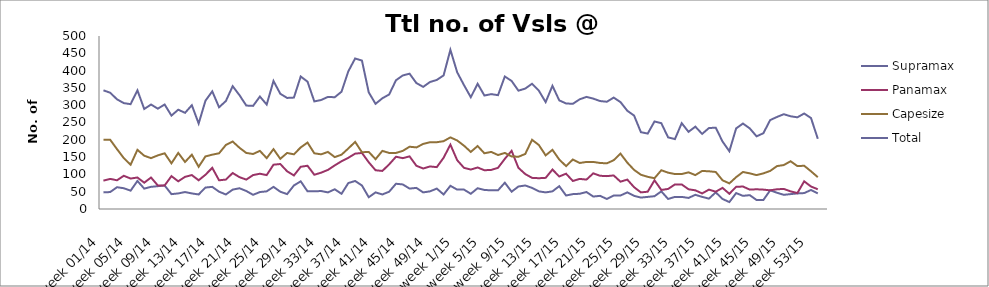
| Category | Supramax | Panamax | Capesize | Total |
|---|---|---|---|---|
| week 01/14 | 48 | 82 | 200 | 343 |
| week 02/14 | 49 | 87 | 200 | 336 |
| week 03/14 | 63 | 83 | 173 | 317 |
| week 04/14 | 60 | 96 | 147 | 306 |
| week 05/14 | 53 | 88 | 128 | 303 |
| week 06/14 | 81 | 91 | 171 | 343 |
| week 07/14 | 59 | 76 | 154 | 289 |
| week 08/14 | 64 | 91 | 147 | 302 |
| week 09/14 | 66 | 68 | 155 | 290 |
| week 10/14 | 68 | 68 | 161 | 302 |
| week 11/14 | 43 | 95 | 132 | 270 |
| week 12/14 | 45 | 80 | 162 | 287 |
| week 13/14 | 49 | 93 | 136 | 278 |
| week 14/14 | 45 | 98 | 157 | 300 |
| week 15/14 | 42 | 83 | 122 | 247 |
| week 16/14 | 62 | 99 | 152 | 313 |
| week 17/14 | 64 | 119 | 157 | 340 |
| week 18/14 | 50 | 83 | 161 | 294 |
| week 19/14 | 42 | 85 | 185 | 312 |
| week 20/14 | 56 | 104 | 195 | 355 |
| week 21/14 | 60 | 92 | 177 | 329 |
| week 22/14 | 52 | 85 | 162 | 299 |
| week 23/14 | 41 | 98 | 159 | 298 |
| week 24/14 | 49 | 102 | 168 | 325 |
| week 25/14 | 51 | 98 | 147 | 302 |
| week 26/14 | 64 | 128 | 173 | 370 |
| week 27/14 | 50 | 130 | 145 | 333 |
| week 28/14 | 43 | 109 | 162 | 321 |
| week 29/14 | 68 | 97 | 158 | 322 |
| week 30/14 | 80 | 122 | 178 | 383 |
| week 31/14 | 51 | 125 | 192 | 368 |
| week 32/14 | 51 | 99 | 161 | 311 |
| week 33/14 | 52 | 105 | 158 | 315 |
| week 34/14 | 48 | 113 | 165 | 324 |
| week 35/14 | 57 | 126 | 150 | 323 |
| week 36/14 | 44 | 138 | 157 | 339 |
| week 37/14 | 75 | 148 | 175 | 398 |
| week 38/14 | 81 | 160 | 194 | 435 |
| week 39/14 | 68 | 162 | 164 | 429 |
| week 40/14 | 34 | 135 | 165 | 337 |
| week 41/14 | 48 | 112 | 144 | 304 |
| week 42/14 | 42 | 110 | 168 | 320 |
| week 43/14 | 50 | 129 | 162 | 331 |
| week 44/14 | 73 | 151 | 162 | 372 |
| week 45/14 | 71 | 147 | 168 | 386 |
| week 46/14 | 59 | 152 | 180 | 391 |
| week 47/14 | 61 | 125 | 178 | 364 |
| week 48/14 | 48 | 117 | 188 | 353 |
| week 49/14 | 51 | 123 | 193 | 367 |
| week 50/14 | 59 | 121 | 193 | 373 |
| week 51/14 | 42 | 148 | 196 | 386 |
| week 52/14 | 67 | 186 | 207 | 460 |
| week 1/15 | 56 | 141 | 198 | 395 |
| week 2/15 | 56 | 119 | 183 | 358 |
| week 3/15 | 44 | 114 | 165 | 323 |
| week 4/15 | 60 | 120 | 182 | 362 |
| week 5/15 | 55 | 112 | 161 | 328 |
| week 6/15 | 54 | 113 | 165 | 332 |
| week 7/15 | 54 | 119 | 156 | 329 |
| week 8/15 | 76 | 145 | 162 | 383 |
| week 9/15 | 50 | 168 | 152 | 370 |
| week 10/15 | 65 | 119 | 151 | 342 |
| week 11/15 | 68 | 101 | 159 | 348 |
| week 12/15 | 61 | 90 | 200 | 362 |
| week 13/15 | 51 | 89 | 185 | 342 |
| week 14/15 | 48 | 90 | 155 | 309 |
| week 15/15 | 51 | 114 | 171 | 356 |
| week 16/15 | 66 | 94 | 143 | 314 |
| week 17/15 | 39 | 102 | 124 | 305 |
| week 18/15 | 43 | 81 | 143 | 304 |
| week 19/15 | 44 | 87 | 133 | 317 |
| week 20/15 | 49 | 85 | 136 | 324 |
| week 21/15 | 36 | 103 | 136 | 319 |
| week 22/15 | 38 | 96 | 133 | 312 |
| week 23/15 | 29 | 95 | 132 | 310 |
| week 24/15 | 39 | 97 | 141 | 322 |
| week 25/15 | 39 | 79 | 160 | 309 |
| week 26/15 | 48 | 85 | 134 | 284 |
| week 27/15 | 38 | 63 | 113 | 270 |
| week 28/15 | 33 | 48 | 99 | 222 |
| week 29/15 | 35 | 50 | 93 | 218 |
| week 30/15 | 37 | 83 | 89 | 253 |
| week 31/15 | 51 | 55 | 112 | 248 |
| week 32/15 | 29 | 58 | 105 | 207 |
| week 33/15 | 35 | 71 | 101 | 202 |
| week 34/15 | 35 | 71 | 101 | 248 |
| week 35/15 | 32 | 57 | 106 | 223 |
| week 36/15 | 41 | 54 | 98 | 238 |
| week 37/15 | 35 | 45 | 110 | 217 |
| week 38/15 | 30 | 56 | 109 | 234 |
| week 39/15 | 48 | 50 | 107 | 235 |
| week 40/15 | 29 | 61 | 83 | 195 |
| week 41/15 | 20 | 44 | 74 | 167 |
| week 42/15 | 46 | 64 | 92 | 233 |
| week 43/15 | 38 | 65 | 107 | 247 |
| week 44/15 | 40 | 56 | 103 | 233 |
| week 45/15 | 26 | 57 | 98 | 210 |
| week 46/15 | 26 | 56 | 103 | 219 |
| week 47/15 | 54 | 54 | 110 | 257 |
| week 48/15 | 47 | 57 | 124 | 266 |
| week 49/15 | 41 | 58 | 127 | 274 |
| week 50/15 | 43 | 51 | 138 | 268 |
| week 51/15 | 45 | 46 | 124 | 265 |
| week 52/15 | 46 | 80 | 125 | 276 |
| week 53/15 | 55 | 65 | 109 | 263 |
| week 01/16 | 45 | 57 | 92 | 203 |